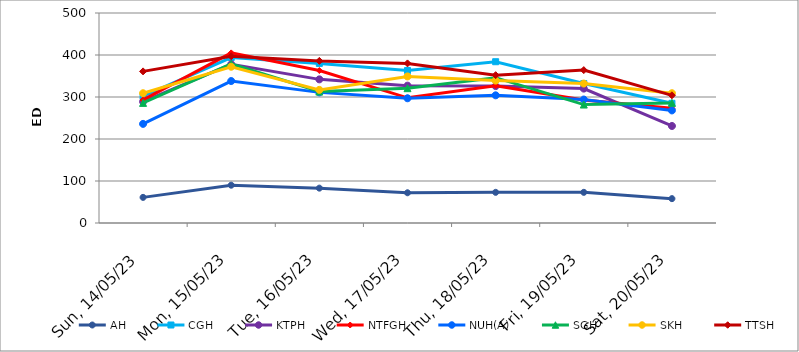
| Category | AH | CGH | KTPH | NTFGH | NUH(A) | SGH | SKH | TTSH |
|---|---|---|---|---|---|---|---|---|
| 2023-05-14 | 61 | 302 | 289 | 293 | 236 | 286 | 309 | 361 |
| 2023-05-15 | 90 | 394 | 378 | 405 | 338 | 379 | 372 | 397 |
| 2023-05-16 | 83 | 380 | 342 | 363 | 311 | 313 | 317 | 386 |
| 2023-05-17 | 72 | 363 | 327 | 298 | 297 | 321 | 349 | 380 |
| 2023-05-18 | 73 | 384 | 326 | 327 | 304 | 346 | 339 | 352 |
| 2023-05-19 | 73 | 332 | 320 | 293 | 294 | 282 | 332 | 364 |
| 2023-05-20 | 58 | 285 | 231 | 273 | 268 | 286 | 309 | 304 |